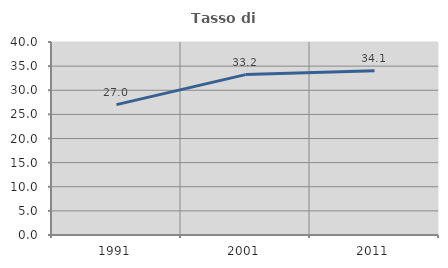
| Category | Tasso di occupazione   |
|---|---|
| 1991.0 | 27.021 |
| 2001.0 | 33.244 |
| 2011.0 | 34.055 |